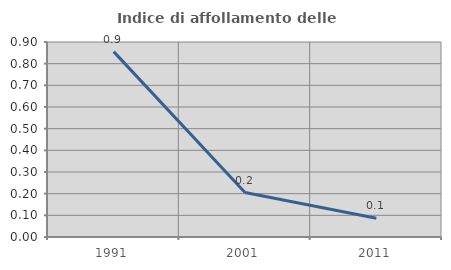
| Category | Indice di affollamento delle abitazioni  |
|---|---|
| 1991.0 | 0.856 |
| 2001.0 | 0.205 |
| 2011.0 | 0.087 |